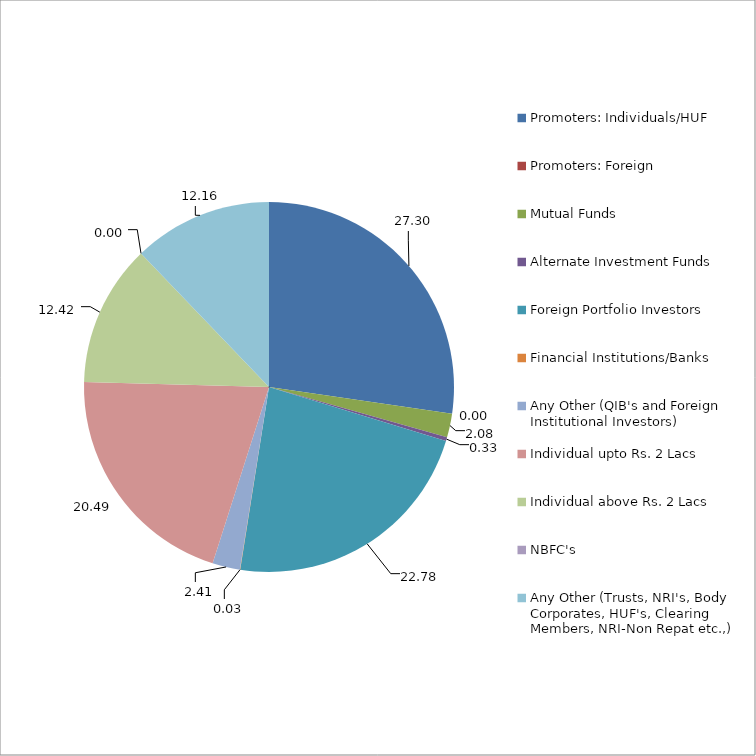
| Category | Series 0 |
|---|---|
| Promoters: Individuals/HUF | 27.3 |
| Promoters: Foreign | 0 |
| Mutual Funds | 2.08 |
| Alternate Investment Funds | 0.33 |
| Foreign Portfolio Investors | 22.78 |
| Financial Institutions/Banks | 0.03 |
| Any Other (QIB's and Foreign Institutional Investors) | 2.41 |
| Individual upto Rs. 2 Lacs | 20.49 |
| Individual above Rs. 2 Lacs | 12.42 |
| NBFC's | 0 |
| Any Other (Trusts, NRI's, Body Corporates, HUF's, Clearing Members, NRI-Non Repat etc.,) | 12.16 |